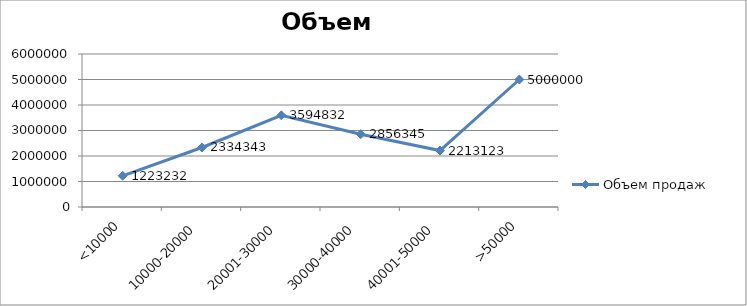
| Category | Объем продаж |
|---|---|
| <10000 | 1223232 |
| 10000-20000 | 2334343 |
| 20001-30000 | 3594832 |
| 30000-40000 | 2856345 |
| 40001-50000 | 2213123 |
| >50000 | 5000000 |